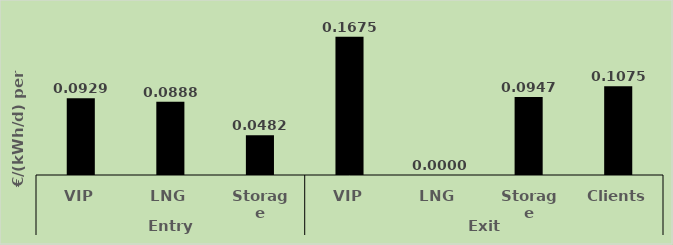
| Category | Series 0 |
|---|---|
| 0 | 0.093 |
| 1 | 0.089 |
| 2 | 0.048 |
| 3 | 0.167 |
| 4 | 0 |
| 5 | 0.095 |
| 6 | 0.108 |